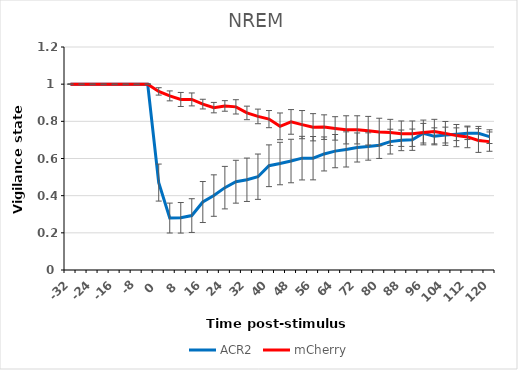
| Category | ACR2 | mCherry |
|---|---|---|
| -32.0 | 1 | 1 |
| -28.0 | 1 | 1 |
| -24.0 | 1 | 1 |
| -20.0 | 1 | 1 |
| -16.0 | 1 | 1 |
| -12.0 | 1 | 1 |
| -8.0 | 1 | 1 |
| -4.0 | 1 | 1 |
| 0.0 | 0.47 | 0.961 |
| 4.0 | 0.28 | 0.937 |
| 8.0 | 0.281 | 0.918 |
| 12.0 | 0.293 | 0.918 |
| 16.0 | 0.366 | 0.893 |
| 20.0 | 0.401 | 0.874 |
| 24.0 | 0.443 | 0.883 |
| 28.0 | 0.475 | 0.878 |
| 32.0 | 0.486 | 0.845 |
| 36.0 | 0.502 | 0.826 |
| 40.0 | 0.561 | 0.812 |
| 44.0 | 0.573 | 0.773 |
| 48.0 | 0.586 | 0.797 |
| 52.0 | 0.602 | 0.782 |
| 56.0 | 0.602 | 0.768 |
| 60.0 | 0.625 | 0.769 |
| 64.0 | 0.64 | 0.762 |
| 68.0 | 0.649 | 0.754 |
| 72.0 | 0.659 | 0.754 |
| 76.0 | 0.665 | 0.75 |
| 80.0 | 0.671 | 0.743 |
| 84.0 | 0.691 | 0.74 |
| 88.0 | 0.698 | 0.734 |
| 92.0 | 0.701 | 0.734 |
| 96.0 | 0.736 | 0.74 |
| 100.0 | 0.719 | 0.745 |
| 104.0 | 0.726 | 0.735 |
| 108.0 | 0.731 | 0.723 |
| 112.0 | 0.736 | 0.716 |
| 116.0 | 0.736 | 0.697 |
| 120.0 | 0.718 | 0.691 |